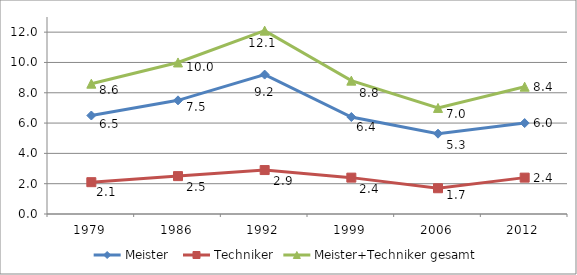
| Category | Meister  | Techniker | Meister+Techniker gesamt |
|---|---|---|---|
| 1979.0 | 6.5 | 2.1 | 8.6 |
| 1986.0 | 7.5 | 2.5 | 10 |
| 1992.0 | 9.2 | 2.9 | 12.1 |
| 1999.0 | 6.4 | 2.4 | 8.8 |
| 2006.0 | 5.3 | 1.7 | 7 |
| 2012.0 | 6 | 2.4 | 8.4 |